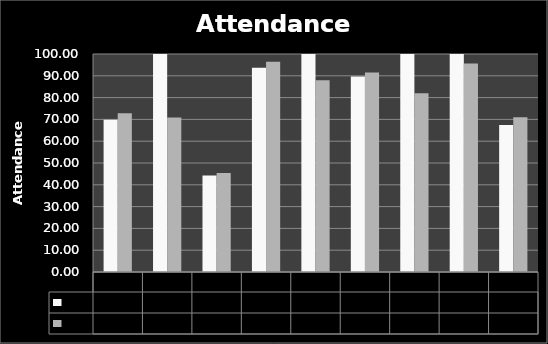
| Category | Pre | Post |
|---|---|---|
| 0 | 69.82 | 72.79 |
| 1 | 100 | 70.83 |
| 2 | 44.23 | 45.45 |
| 3 | 93.75 | 96.45 |
| 4 | 100 | 88.01 |
| 5 | 89.64 | 91.5 |
| 6 | 100 | 81.94 |
| 7 | 100 | 95.68 |
| 8 | 67.41 | 70.98 |